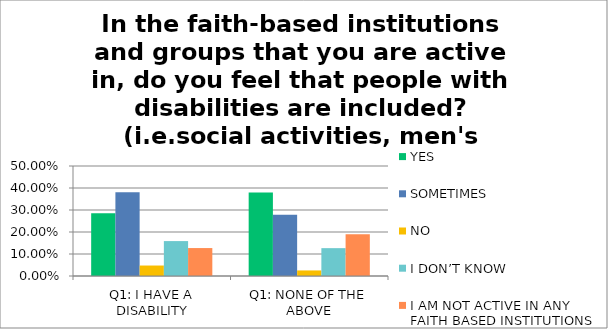
| Category | YES | SOMETIMES | NO | I DON’T KNOW | I AM NOT ACTIVE IN ANY FAITH BASED INSTITUTIONS |
|---|---|---|---|---|---|
| Q1: I HAVE A DISABILITY | 0.286 | 0.381 | 0.048 | 0.159 | 0.127 |
| Q1: NONE OF THE ABOVE | 0.38 | 0.278 | 0.025 | 0.127 | 0.19 |